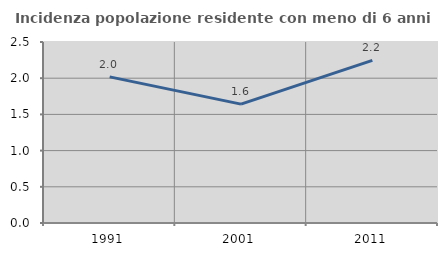
| Category | Incidenza popolazione residente con meno di 6 anni |
|---|---|
| 1991.0 | 2.019 |
| 2001.0 | 1.642 |
| 2011.0 | 2.246 |